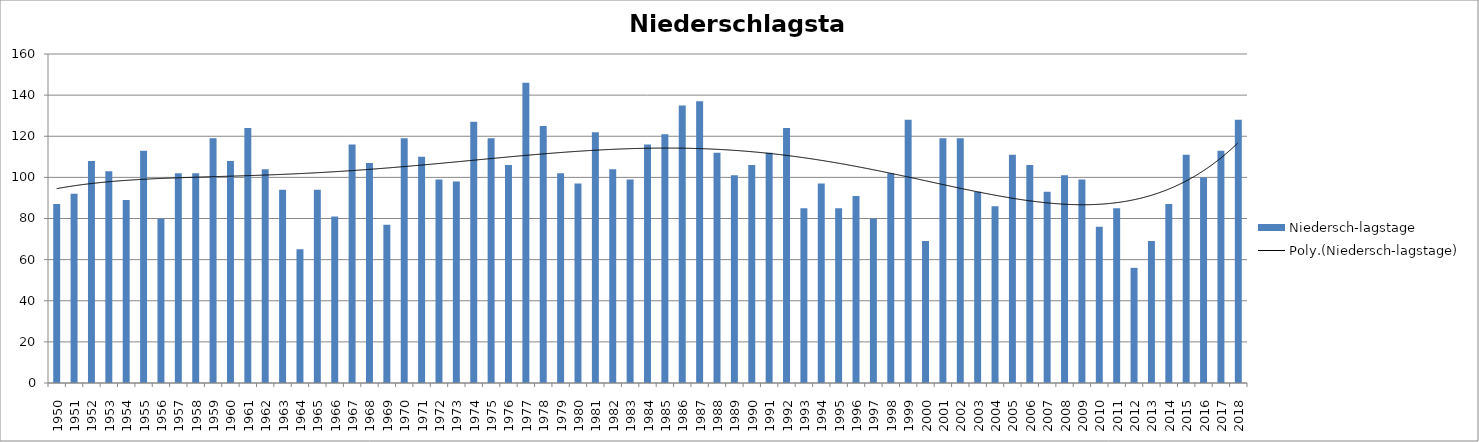
| Category | Niedersch-lagstage |
|---|---|
| 1950.0 | 87 |
| 1951.0 | 92 |
| 1952.0 | 108 |
| 1953.0 | 103 |
| 1954.0 | 89 |
| 1955.0 | 113 |
| 1956.0 | 80 |
| 1957.0 | 102 |
| 1958.0 | 102 |
| 1959.0 | 119 |
| 1960.0 | 108 |
| 1961.0 | 124 |
| 1962.0 | 104 |
| 1963.0 | 94 |
| 1964.0 | 65 |
| 1965.0 | 94 |
| 1966.0 | 81 |
| 1967.0 | 116 |
| 1968.0 | 107 |
| 1969.0 | 77 |
| 1970.0 | 119 |
| 1971.0 | 110 |
| 1972.0 | 99 |
| 1973.0 | 98 |
| 1974.0 | 127 |
| 1975.0 | 119 |
| 1976.0 | 106 |
| 1977.0 | 146 |
| 1978.0 | 125 |
| 1979.0 | 102 |
| 1980.0 | 97 |
| 1981.0 | 122 |
| 1982.0 | 104 |
| 1983.0 | 99 |
| 1984.0 | 116 |
| 1985.0 | 121 |
| 1986.0 | 135 |
| 1987.0 | 137 |
| 1988.0 | 112 |
| 1989.0 | 101 |
| 1990.0 | 106 |
| 1991.0 | 112 |
| 1992.0 | 124 |
| 1993.0 | 85 |
| 1994.0 | 97 |
| 1995.0 | 85 |
| 1996.0 | 91 |
| 1997.0 | 80 |
| 1998.0 | 102 |
| 1999.0 | 128 |
| 2000.0 | 69 |
| 2001.0 | 119 |
| 2002.0 | 119 |
| 2003.0 | 93 |
| 2004.0 | 86 |
| 2005.0 | 111 |
| 2006.0 | 106 |
| 2007.0 | 93 |
| 2008.0 | 101 |
| 2009.0 | 99 |
| 2010.0 | 76 |
| 2011.0 | 85 |
| 2012.0 | 56 |
| 2013.0 | 69 |
| 2014.0 | 87 |
| 2015.0 | 111 |
| 2016.0 | 100 |
| 2017.0 | 113 |
| 2018.0 | 128 |